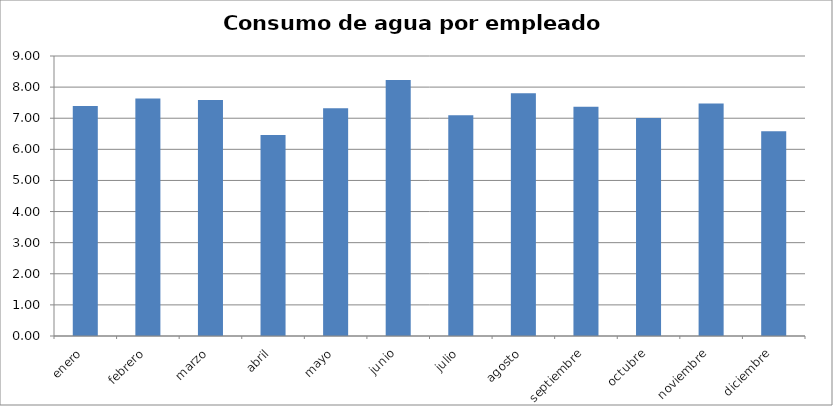
| Category | Series 0 |
|---|---|
| enero | 7.389 |
| febrero | 7.632 |
| marzo | 7.584 |
| abril | 6.458 |
| mayo | 7.321 |
| junio | 8.226 |
| julio | 7.095 |
| agosto | 7.8 |
| septiembre | 7.368 |
| octubre | 7.005 |
| noviembre | 7.474 |
| diciembre | 6.579 |